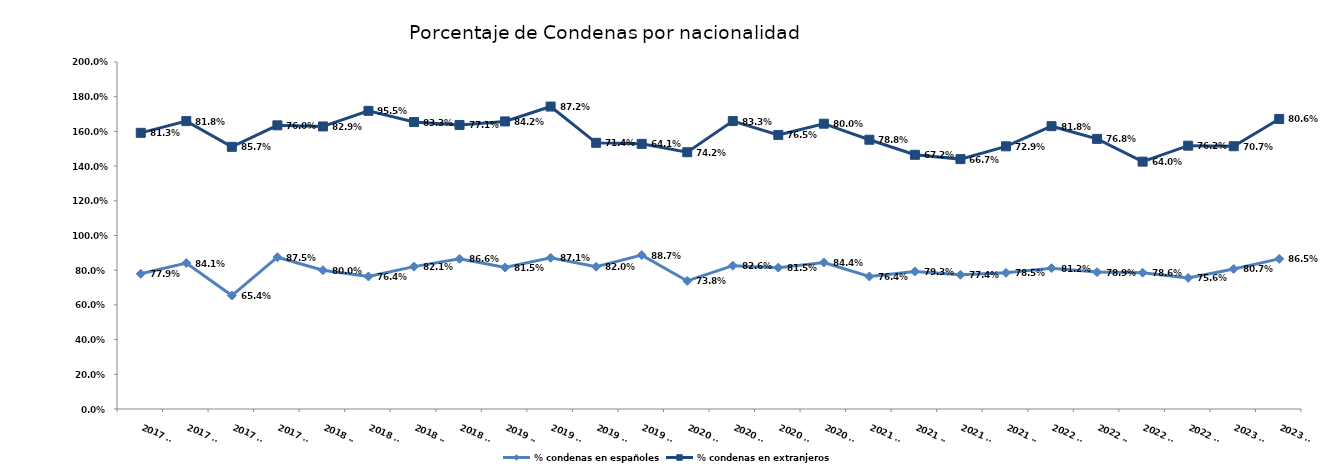
| Category | % condenas en españoles | % condenas en extranjeros |
|---|---|---|
| 2017 T1 | 0.779 | 0.812 |
| 2017 T2 | 0.841 | 0.818 |
| 2017 T3 | 0.654 | 0.857 |
| 2017 T4 | 0.875 | 0.76 |
| 2018 T1 | 0.8 | 0.829 |
| 2018 T2 | 0.764 | 0.955 |
| 2018 T3 | 0.821 | 0.833 |
| 2018 T4 | 0.866 | 0.771 |
| 2019 T1 | 0.815 | 0.842 |
| 2019 T2 | 0.871 | 0.872 |
| 2019 T3 | 0.82 | 0.714 |
| 2019 T4 | 0.887 | 0.641 |
| 2020 T1 | 0.738 | 0.742 |
| 2020 T2 | 0.826 | 0.833 |
| 2020 T3 | 0.815 | 0.765 |
| 2020 T4 | 0.844 | 0.8 |
| 2021 T1 | 0.764 | 0.788 |
| 2021 T2 | 0.793 | 0.672 |
| 2021 T3 | 0.774 | 0.667 |
| 2021 T4 | 0.785 | 0.729 |
| 2022 T1 | 0.812 | 0.818 |
| 2022 T2 | 0.789 | 0.768 |
| 2022 T3 | 0.786 | 0.64 |
| 2022 T4 | 0.756 | 0.762 |
| 2023 T1 | 0.807 | 0.707 |
| 2023 T2 | 0.865 | 0.806 |